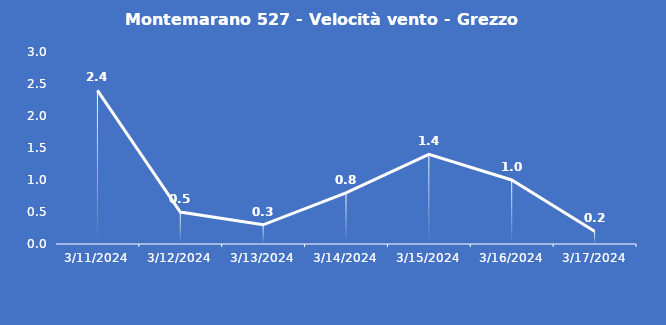
| Category | Montemarano 527 - Velocità vento - Grezzo (m/s) |
|---|---|
| 3/11/24 | 2.4 |
| 3/12/24 | 0.5 |
| 3/13/24 | 0.3 |
| 3/14/24 | 0.8 |
| 3/15/24 | 1.4 |
| 3/16/24 | 1 |
| 3/17/24 | 0.2 |